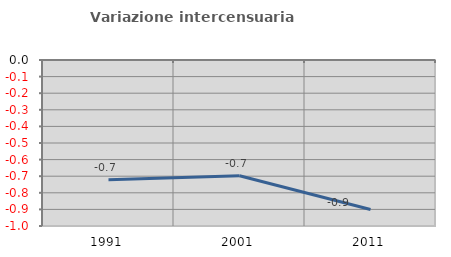
| Category | Variazione intercensuaria annua |
|---|---|
| 1991.0 | -0.721 |
| 2001.0 | -0.697 |
| 2011.0 | -0.901 |